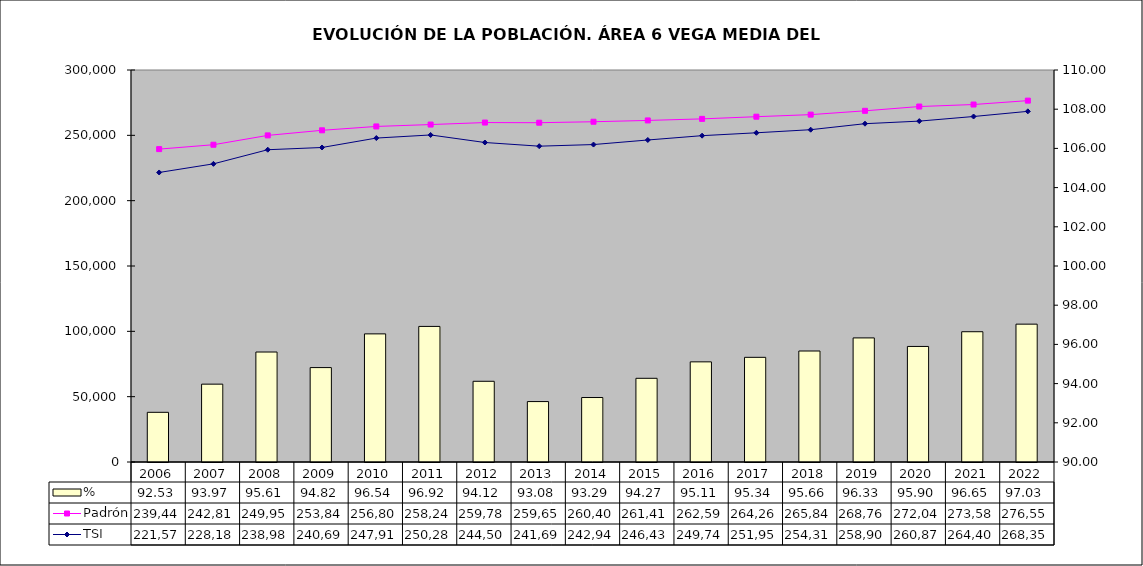
| Category | % |
|---|---|
| 2006.0 | 92.535 |
| 2007.0 | 93.972 |
| 2008.0 | 95.611 |
| 2009.0 | 94.817 |
| 2010.0 | 96.536 |
| 2011.0 | 96.917 |
| 2012.0 | 94.118 |
| 2013.0 | 93.083 |
| 2014.0 | 93.29 |
| 2015.0 | 94.27 |
| 2016.0 | 95.11 |
| 2017.0 | 95.34 |
| 2018.0 | 95.663 |
| 2019.0 | 96.331 |
| 2020.0 | 95.896 |
| 2021.0 | 96.646 |
| 2022.0 | 97.033 |